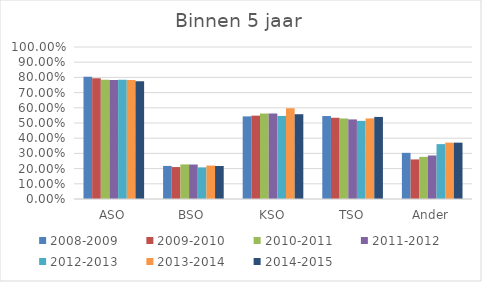
| Category | 2008-2009 | 2009-2010 | 2010-2011 | 2011-2012 | 2012-2013 | 2013-2014 | 2014-2015 |
|---|---|---|---|---|---|---|---|
| ASO | 0.804 | 0.794 | 0.784 | 0.783 | 0.784 | 0.784 | 0.775 |
| BSO | 0.218 | 0.21 | 0.228 | 0.227 | 0.208 | 0.22 | 0.217 |
| KSO | 0.544 | 0.548 | 0.563 | 0.562 | 0.547 | 0.598 | 0.558 |
| TSO | 0.546 | 0.534 | 0.53 | 0.524 | 0.514 | 0.53 | 0.54 |
| Ander | 0.304 | 0.26 | 0.277 | 0.286 | 0.361 | 0.371 | 0.371 |